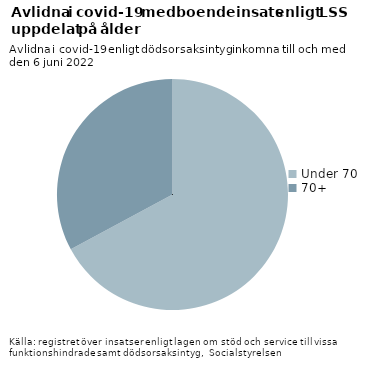
| Category | Ålder |
|---|---|
| Under 70 | 94 |
| 70+ | 46 |